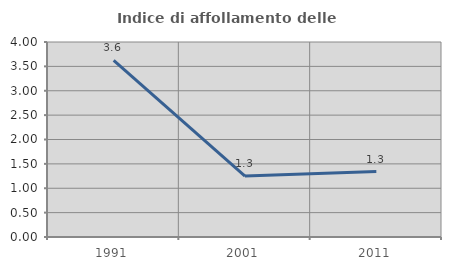
| Category | Indice di affollamento delle abitazioni  |
|---|---|
| 1991.0 | 3.623 |
| 2001.0 | 1.25 |
| 2011.0 | 1.342 |